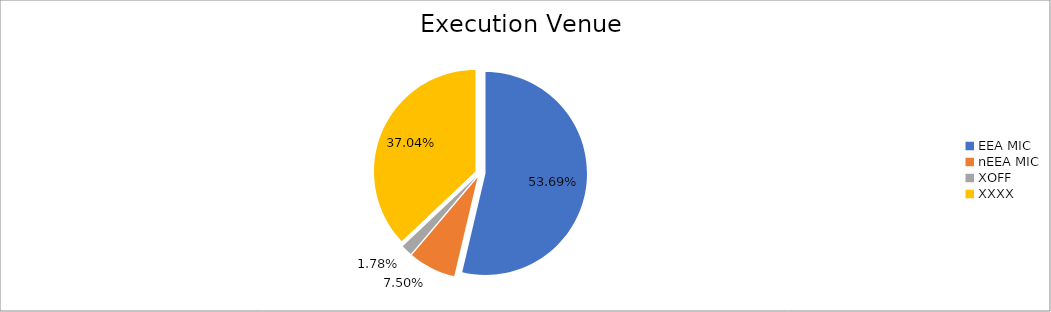
| Category | Series 0 |
|---|---|
| EEA MIC | 7165270.885 |
| nEEA MIC | 1000828.96 |
| XOFF | 237649.65 |
| XXXX | 4943123.866 |